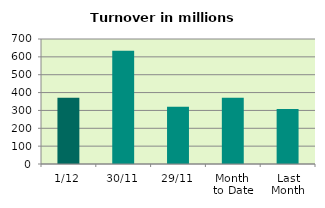
| Category | Series 0 |
|---|---|
| 1/12 | 371.466 |
| 30/11 | 633.782 |
| 29/11 | 320.684 |
| Month 
to Date | 371.466 |
| Last
Month | 307.664 |